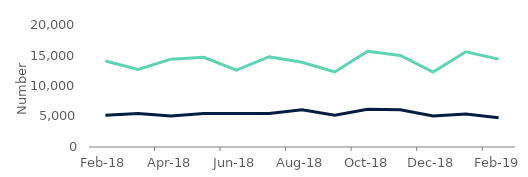
| Category | House purchase | Remortgage |
|---|---|---|
| 2018-02-01 | 5200 | 14100 |
| 2018-03-01 | 5500 | 12700 |
| 2018-04-01 | 5100 | 14400 |
| 2018-05-01 | 5500 | 14700 |
| 2018-06-01 | 5500 | 12600 |
| 2018-07-01 | 5500 | 14800 |
| 2018-08-01 | 6100 | 13900 |
| 2018-09-01 | 5200 | 12300 |
| 2018-10-01 | 6200 | 15700 |
| 2018-11-01 | 6100 | 15000 |
| 2018-12-01 | 5100 | 12300 |
| 2019-01-01 | 5400 | 15600 |
| 2019-02-01 | 4800 | 14400 |